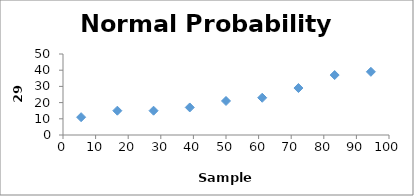
| Category | Series 0 |
|---|---|
| 5.555555555555555 | 11 |
| 16.666666666666664 | 15 |
| 27.77777777777778 | 15 |
| 38.888888888888886 | 17 |
| 50.0 | 21 |
| 61.111111111111114 | 23 |
| 72.22222222222221 | 29 |
| 83.33333333333333 | 37 |
| 94.44444444444444 | 39 |